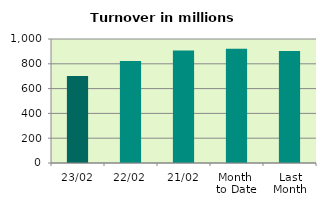
| Category | Series 0 |
|---|---|
| 23/02 | 700.797 |
| 22/02 | 823.093 |
| 21/02 | 907.643 |
| Month 
to Date | 920.653 |
| Last
Month | 902.557 |